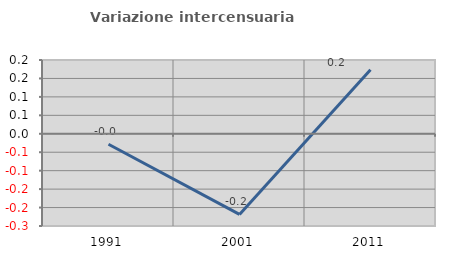
| Category | Variazione intercensuaria annua |
|---|---|
| 1991.0 | -0.028 |
| 2001.0 | -0.219 |
| 2011.0 | 0.174 |